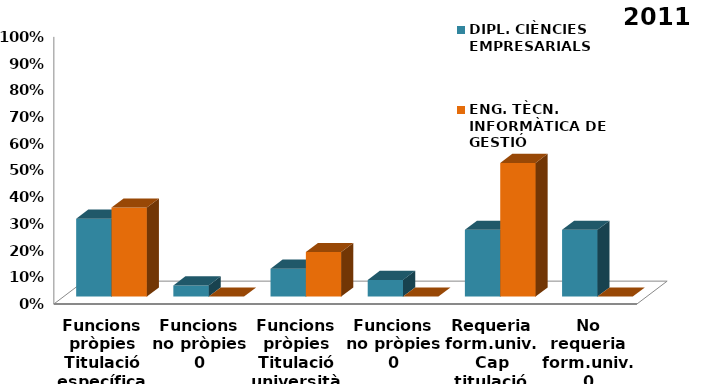
| Category | DIPL. CIÈNCIES EMPRESARIALS | ENG. TÈCN. INFORMÀTICA DE GESTIÓ |
|---|---|---|
| 0 | 0.292 | 0.333 |
| 1 | 0.042 | 0 |
| 2 | 0.104 | 0.167 |
| 3 | 0.062 | 0 |
| 4 | 0.25 | 0.5 |
| 5 | 0.25 | 0 |